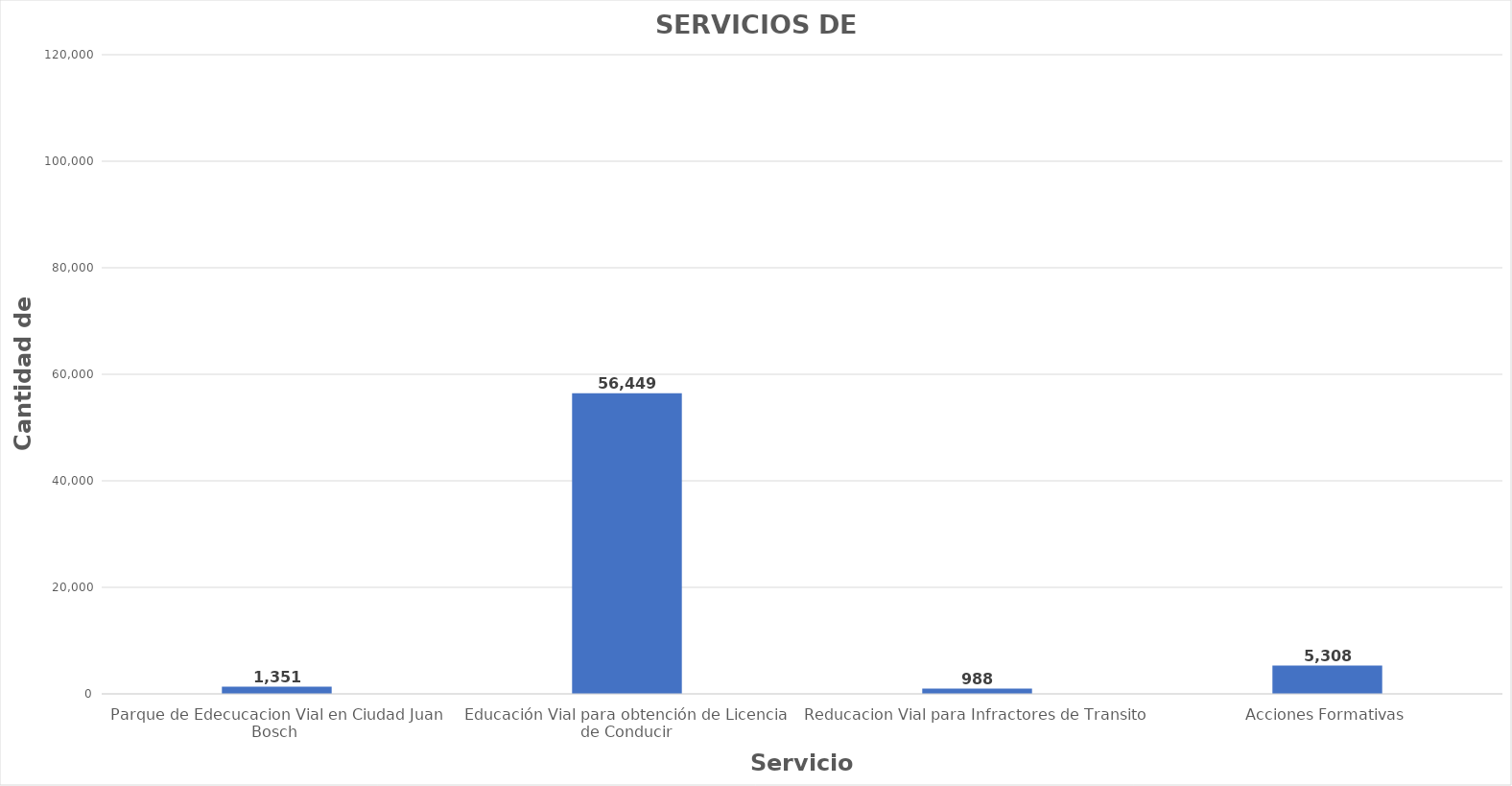
| Category | Series 0 |
|---|---|
| Parque de Edecucacion Vial en Ciudad Juan Bosch  | 1351 |
| Educación Vial para obtención de Licencia de Conducir | 56449 |
| Reducacion Vial para Infractores de Transito  | 988 |
| Acciones Formativas | 5308 |